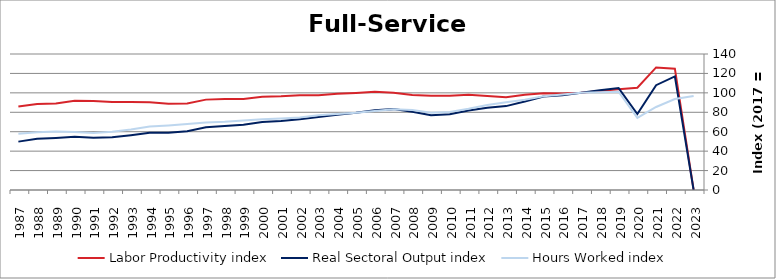
| Category | Labor Productivity index | Real Sectoral Output index | Hours Worked index |
|---|---|---|---|
| 2023.0 | 0 | 0 | 96.789 |
| 2022.0 | 124.916 | 116.981 | 93.647 |
| 2021.0 | 126.201 | 107.877 | 85.48 |
| 2020.0 | 105.349 | 78.152 | 74.184 |
| 2019.0 | 103.741 | 104.911 | 101.128 |
| 2018.0 | 102.029 | 102.746 | 100.702 |
| 2017.0 | 100 | 100 | 100 |
| 2016.0 | 99.216 | 97.601 | 98.372 |
| 2015.0 | 99.716 | 96.178 | 96.452 |
| 2014.0 | 97.966 | 91.031 | 92.921 |
| 2013.0 | 95.569 | 86.355 | 90.359 |
| 2012.0 | 96.789 | 84.606 | 87.412 |
| 2011.0 | 97.937 | 81.815 | 83.538 |
| 2010.0 | 96.954 | 77.871 | 80.317 |
| 2009.0 | 96.987 | 77.065 | 79.459 |
| 2008.0 | 97.844 | 80.61 | 82.386 |
| 2007.0 | 100.017 | 83.251 | 83.236 |
| 2006.0 | 101.077 | 82.169 | 81.293 |
| 2005.0 | 99.937 | 79.426 | 79.476 |
| 2004.0 | 99.205 | 77.577 | 78.198 |
| 2003.0 | 97.549 | 75.051 | 76.937 |
| 2002.0 | 97.564 | 72.833 | 74.651 |
| 2001.0 | 96.52 | 70.957 | 73.515 |
| 2000.0 | 96.076 | 69.913 | 72.768 |
| 1999.0 | 93.777 | 67.151 | 71.607 |
| 1998.0 | 93.768 | 65.841 | 70.218 |
| 1997.0 | 93.033 | 64.627 | 69.467 |
| 1996.0 | 89.117 | 60.571 | 67.968 |
| 1995.0 | 88.848 | 59.039 | 66.449 |
| 1994.0 | 90.26 | 58.901 | 65.257 |
| 1993.0 | 90.552 | 56.398 | 62.282 |
| 1992.0 | 90.652 | 54.312 | 59.913 |
| 1991.0 | 91.694 | 53.88 | 58.761 |
| 1990.0 | 91.93 | 54.791 | 59.6 |
| 1989.0 | 89.03 | 53.606 | 60.211 |
| 1988.0 | 88.601 | 52.668 | 59.444 |
| 1987.0 | 86.011 | 49.797 | 57.896 |